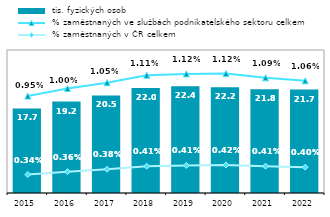
| Category |  tis. fyzických osob |
|---|---|
| 2015.0 | 17.733 |
| 2016.0 | 19.175 |
| 2017.0 | 20.459 |
| 2018.0 | 22.009 |
| 2019.0 | 22.374 |
| 2020.0 | 22.19 |
| 2021.0 | 21.769 |
| 2022.0 | 21.689 |